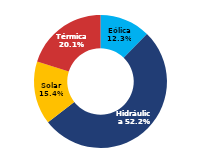
| Category | Sur |
|---|---|
| Eólica | 65.113 |
| Hidráulica | 275.933 |
| Solar | 81.511 |
| Térmica | 106.348 |